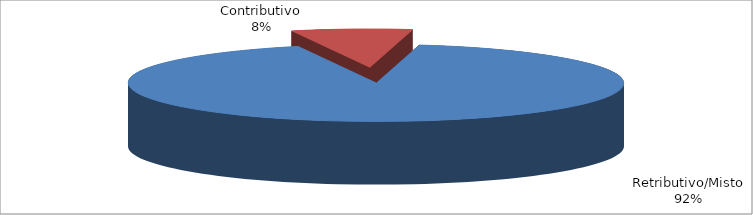
| Category | Decorrenti gennaio - giugno 2022 |
|---|---|
| Retributivo/Misto | 153530 |
| Contributivo | 13122 |